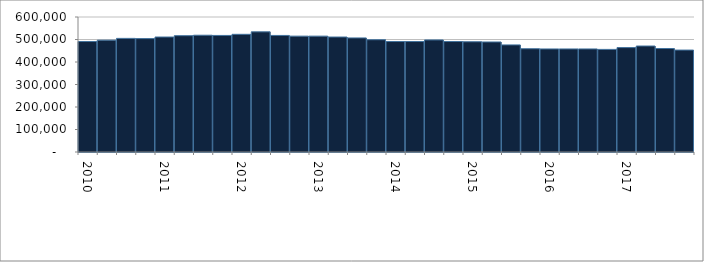
| Category | Series 0 |
|---|---|
| 2010.0 | 491000 |
| nan | 497000 |
| nan | 505000 |
| nan | 504000 |
| 2011.0 | 511000 |
| nan | 517000 |
| nan | 519000 |
| nan | 518000 |
| 2012.0 | 523000 |
| nan | 534000 |
| nan | 518000 |
| nan | 515000 |
| 2013.0 | 515000 |
| nan | 511000 |
| nan | 507000 |
| nan | 499000 |
| 2014.0 | 491000 |
| nan | 491000 |
| nan | 498000 |
| nan | 491000 |
| 2015.0 | 490000 |
| nan | 489000 |
| nan | 476000 |
| nan | 459000 |
| 2016.0 | 458000 |
| nan | 458000 |
| nan | 458000 |
| nan | 456000 |
| 2017.0 | 464000 |
| nan | 471000 |
| nan | 460000 |
| nan | 453000 |